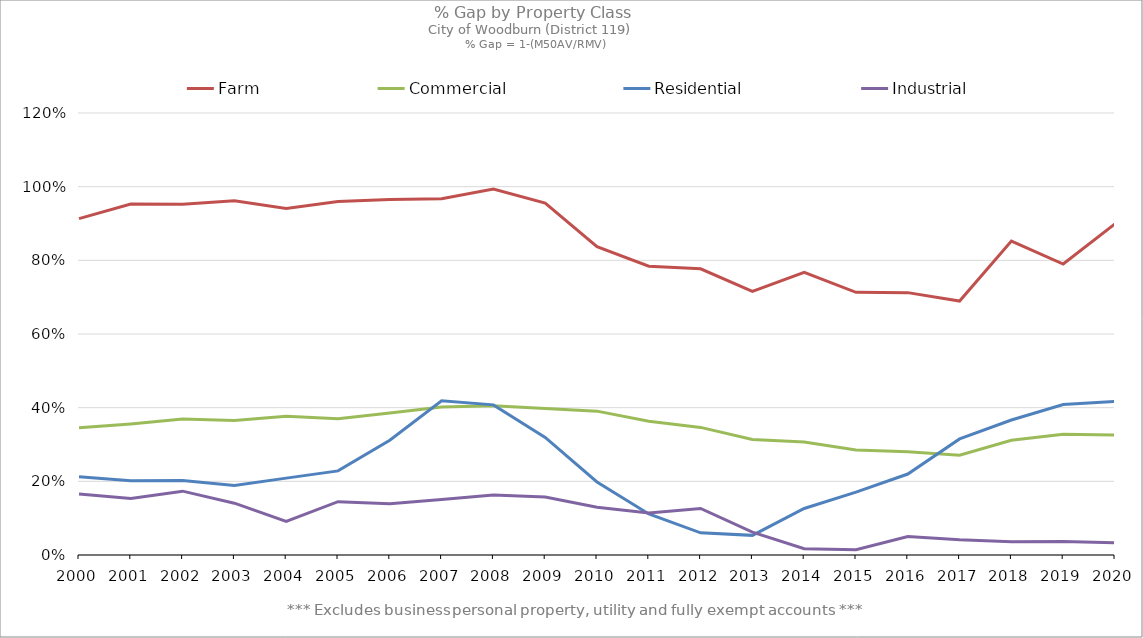
| Category | Farm | Commercial | Residential | Industrial |
|---|---|---|---|---|
| 2000.0 | 0.913 | 0.346 | 0.212 | 0.166 |
| 2001.0 | 0.953 | 0.356 | 0.201 | 0.154 |
| 2002.0 | 0.952 | 0.369 | 0.202 | 0.173 |
| 2003.0 | 0.962 | 0.365 | 0.189 | 0.141 |
| 2004.0 | 0.94 | 0.376 | 0.209 | 0.092 |
| 2005.0 | 0.96 | 0.37 | 0.228 | 0.145 |
| 2006.0 | 0.965 | 0.385 | 0.311 | 0.139 |
| 2007.0 | 0.967 | 0.402 | 0.418 | 0.15 |
| 2008.0 | 0.993 | 0.405 | 0.408 | 0.163 |
| 2009.0 | 0.955 | 0.398 | 0.319 | 0.157 |
| 2010.0 | 0.837 | 0.391 | 0.198 | 0.13 |
| 2011.0 | 0.784 | 0.363 | 0.111 | 0.114 |
| 2012.0 | 0.777 | 0.346 | 0.06 | 0.126 |
| 2013.0 | 0.716 | 0.314 | 0.053 | 0.062 |
| 2014.0 | 0.768 | 0.307 | 0.126 | 0.017 |
| 2015.0 | 0.713 | 0.285 | 0.171 | 0.014 |
| 2016.0 | 0.712 | 0.281 | 0.22 | 0.05 |
| 2017.0 | 0.69 | 0.271 | 0.315 | 0.041 |
| 2018.0 | 0.852 | 0.311 | 0.366 | 0.036 |
| 2019.0 | 0.79 | 0.328 | 0.409 | 0.037 |
| 2020.0 | 0.899 | 0.326 | 0.417 | 0.033 |